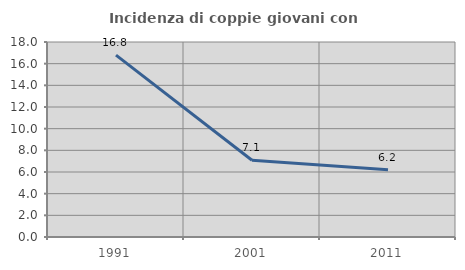
| Category | Incidenza di coppie giovani con figli |
|---|---|
| 1991.0 | 16.792 |
| 2001.0 | 7.087 |
| 2011.0 | 6.197 |